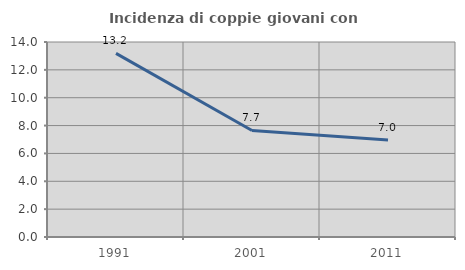
| Category | Incidenza di coppie giovani con figli |
|---|---|
| 1991.0 | 13.187 |
| 2001.0 | 7.65 |
| 2011.0 | 6.965 |